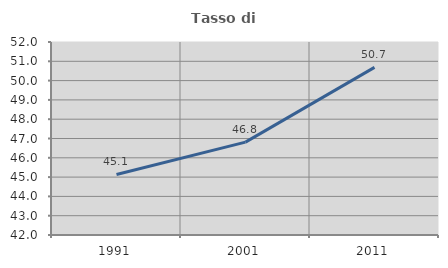
| Category | Tasso di occupazione   |
|---|---|
| 1991.0 | 45.137 |
| 2001.0 | 46.813 |
| 2011.0 | 50.685 |